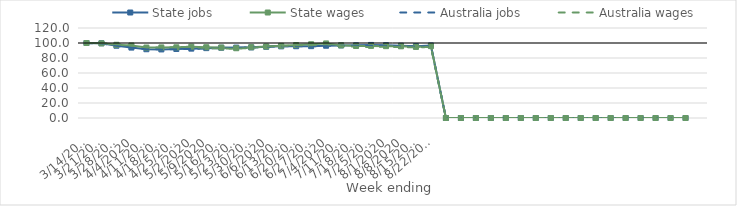
| Category | State jobs | State wages | Australia jobs | Australia wages |
|---|---|---|---|---|
| 14/03/2020 | 100 | 100 | 100 | 100 |
| 21/03/2020 | 99.618 | 99.537 | 99.297 | 99.676 |
| 28/03/2020 | 96.368 | 97.64 | 96.353 | 98.41 |
| 04/04/2020 | 93.877 | 96.728 | 93.695 | 96.734 |
| 11/04/2020 | 91.681 | 93.952 | 91.951 | 94.156 |
| 18/04/2020 | 91.419 | 94.09 | 91.482 | 94.08 |
| 25/04/2020 | 92.016 | 94.266 | 91.798 | 94.248 |
| 02/05/2020 | 92.491 | 95.12 | 92.191 | 94.724 |
| 09/05/2020 | 93.152 | 94.381 | 92.737 | 93.356 |
| 16/05/2020 | 93.728 | 93.939 | 93.262 | 92.686 |
| 23/05/2020 | 93.883 | 93.015 | 93.563 | 92.308 |
| 30/05/2020 | 94.141 | 94.375 | 94.077 | 93.6 |
| 06/06/2020 | 94.952 | 95.338 | 95.016 | 95.393 |
| 13/06/2020 | 95.523 | 96.308 | 95.489 | 96.094 |
| 20/06/2020 | 95.695 | 97.314 | 95.696 | 96.969 |
| 27/06/2020 | 95.794 | 98.336 | 95.581 | 96.996 |
| 04/07/2020 | 96.366 | 99.433 | 96.174 | 98.514 |
| 11/07/2020 | 96.746 | 96.885 | 96.395 | 95.769 |
| 18/07/2020 | 96.904 | 96.003 | 96.226 | 95.048 |
| 25/07/2020 | 97.432 | 96.139 | 96.271 | 94.643 |
| 01/08/2020 | 97.059 | 95.788 | 96.155 | 94.947 |
| 08/08/2020 | 96.442 | 95.596 | 95.543 | 94.567 |
| 15/08/2020 | 95.783 | 94.762 | 95.204 | 94.097 |
| 22/08/2020 | 96.752 | 95.818 | 95.812 | 94.778 |